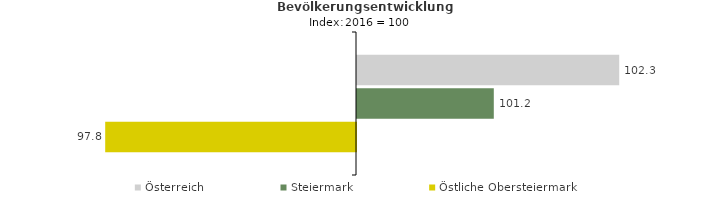
| Category | Österreich | Steiermark | Östliche Obersteiermark |
|---|---|---|---|
| 2020.0 | 102.3 | 101.2 | 97.8 |